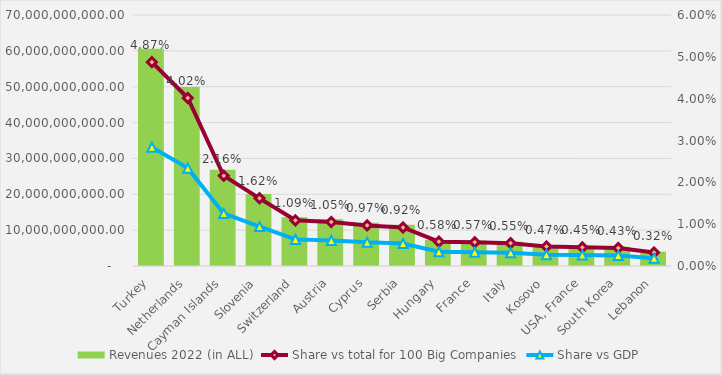
| Category | Revenues 2022 (in ALL) |
|---|---|
| Turkey | 60603572962 |
| Netherlands | 49928520788 |
| Cayman Islands | 26829000000 |
| Slovenia | 20114011888 |
| Switzerland | 13584176000 |
| Austria | 13062458000 |
| Cyprus | 12056748000 |
| Serbia | 11474876424 |
| Hungary | 7239471000 |
| France | 7074191064 |
| Italy | 6777726000 |
| Kosovo | 5792772756 |
| USA, France | 5554972201 |
| South Korea | 5365678864 |
| Lebanon | 4000000000 |